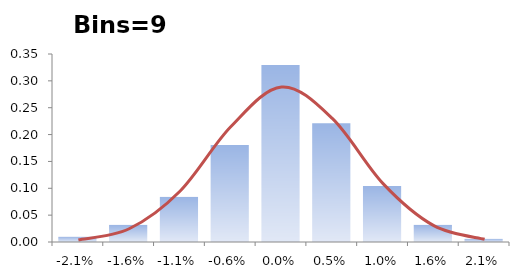
| Category | Series 0 |
|---|---|
| -0.0213994229780292 | 0.01 |
| -0.016106841064984834 | 0.032 |
| -0.010814259151940467 | 0.084 |
| -0.005521677238896098 | 0.181 |
| -0.00022909532585172789 | 0.329 |
| 0.005063486587192642 | 0.221 |
| 0.010356068500237011 | 0.104 |
| 0.015648650413281378 | 0.032 |
| 0.02094123232632575 | 0.006 |